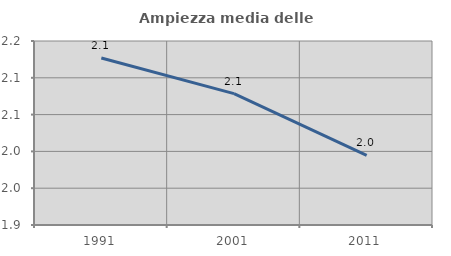
| Category | Ampiezza media delle famiglie |
|---|---|
| 1991.0 | 2.127 |
| 2001.0 | 2.079 |
| 2011.0 | 1.995 |